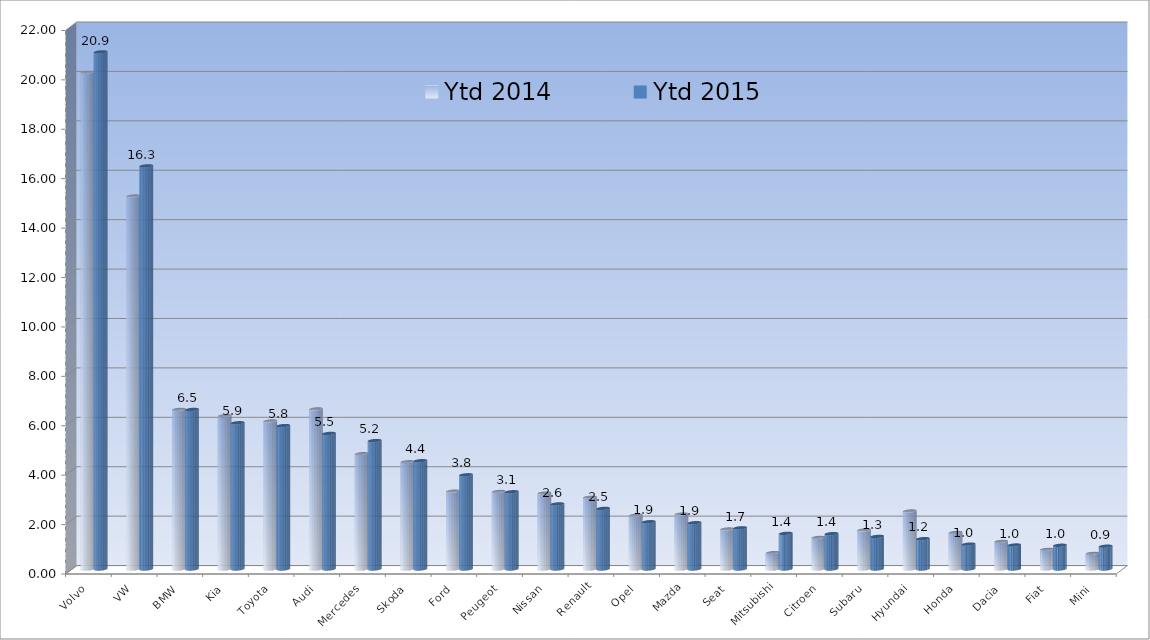
| Category | Ytd 2014 | Ytd 2015 |
|---|---|---|
| Volvo | 20.106 | 20.93 |
| VW | 15.096 | 16.316 |
| BMW | 6.46 | 6.459 |
| Kia | 6.202 | 5.92 |
| Toyota | 5.992 | 5.804 |
| Audi | 6.478 | 5.486 |
| Mercedes | 4.666 | 5.198 |
| Skoda | 4.341 | 4.383 |
| Ford | 3.151 | 3.812 |
| Peugeot | 3.139 | 3.126 |
| Nissan | 3.073 | 2.634 |
| Renault | 2.906 | 2.452 |
| Opel | 2.177 | 1.913 |
| Mazda | 2.224 | 1.874 |
| Seat | 1.618 | 1.666 |
| Mitsubishi | 0.664 | 1.443 |
| Citroen | 1.28 | 1.431 |
| Subaru | 1.581 | 1.319 |
| Hyundai | 2.348 | 1.227 |
| Honda | 1.48 | 1.006 |
| Dacia | 1.117 | 0.97 |
| Fiat | 0.796 | 0.96 |
| Mini | 0.633 | 0.923 |